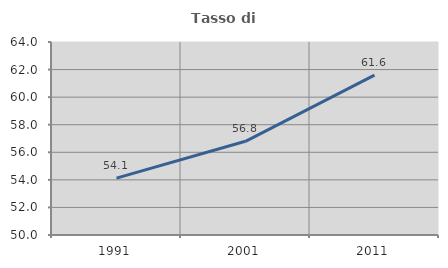
| Category | Tasso di occupazione   |
|---|---|
| 1991.0 | 54.13 |
| 2001.0 | 56.796 |
| 2011.0 | 61.597 |